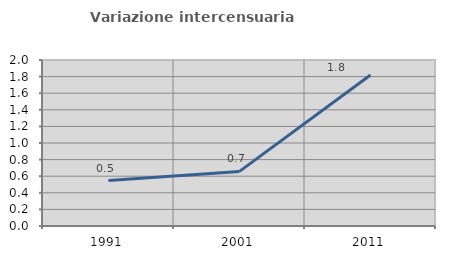
| Category | Variazione intercensuaria annua |
|---|---|
| 1991.0 | 0.548 |
| 2001.0 | 0.658 |
| 2011.0 | 1.82 |